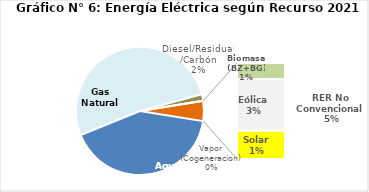
| Category | Series 0 |
|---|---|
| Agua | 1956.484 |
| Gas Natural | 2456.205 |
| Diesel/Residual/Carbón | 78.246 |
| Vapor (Cogeneracion) | 1.057 |
| Biomasa (BZ+BG) | 40.521 |
| Eólica | 128.847 |
| Solar | 70.822 |